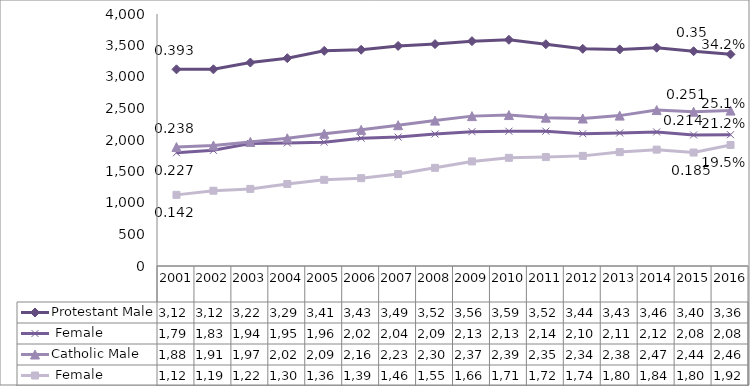
| Category | Protestant | Catholic |
|---|---|---|
| 2001.0 | 1798 | 1129 |
| 2002.0 | 1836 | 1195 |
| 2003.0 | 1945 | 1224 |
| 2004.0 | 1953 | 1302 |
| 2005.0 | 1966 | 1368 |
| 2006.0 | 2029 | 1394 |
| 2007.0 | 2046 | 1460 |
| 2008.0 | 2094 | 1558 |
| 2009.0 | 2132 | 1660 |
| 2010.0 | 2139 | 1717 |
| 2011.0 | 2140 | 1729 |
| 2012.0 | 2100 | 1748 |
| 2013.0 | 2112 | 1808 |
| 2014.0 | 2128 | 1847 |
| 2015.0 | 2080 | 1801 |
| 2016.0 | 2084 | 1921 |